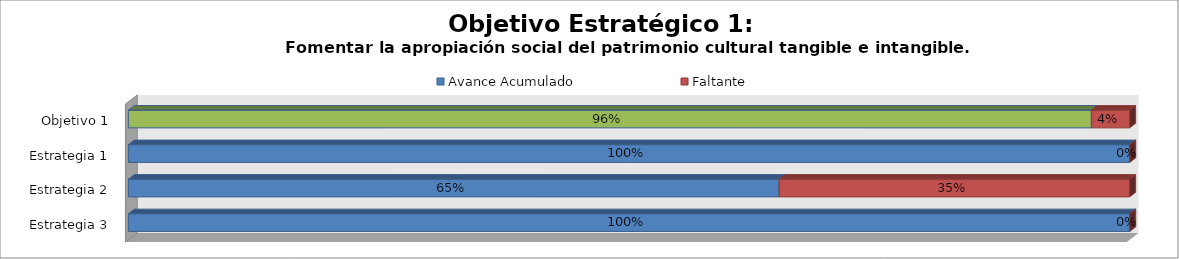
| Category | Avance Acumulado | Faltante |
|---|---|---|
| Estrategia 3 | 1 | 0 |
| Estrategia 2 | 0.65 | 0.35 |
| Estrategia 1 | 1 | 0 |
| Objetivo 1 | 0.962 | 0.038 |